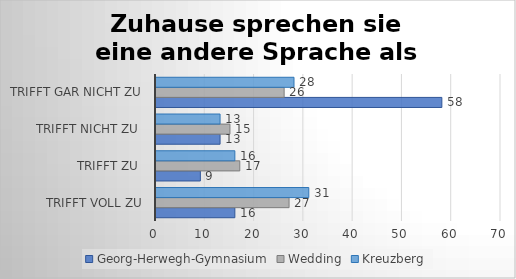
| Category | Georg-Herwegh-Gymnasium | Wedding | Kreuzberg |
|---|---|---|---|
| trifft voll zu | 16 | 27 | 31 |
| trifft zu  | 9 | 17 | 16 |
| trifft nicht zu  | 13 | 15 | 13 |
| trifft gar nicht zu | 58 | 26 | 28 |